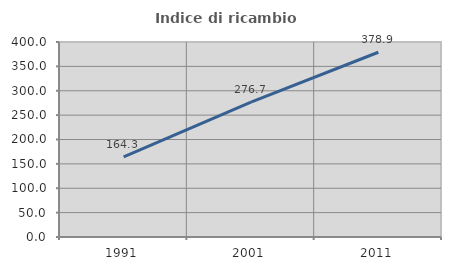
| Category | Indice di ricambio occupazionale  |
|---|---|
| 1991.0 | 164.286 |
| 2001.0 | 276.667 |
| 2011.0 | 378.947 |